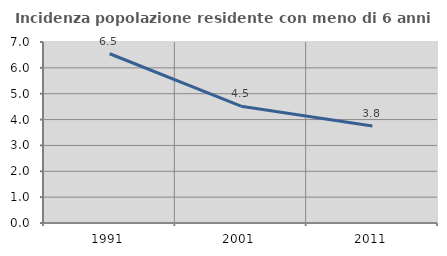
| Category | Incidenza popolazione residente con meno di 6 anni |
|---|---|
| 1991.0 | 6.545 |
| 2001.0 | 4.518 |
| 2011.0 | 3.753 |